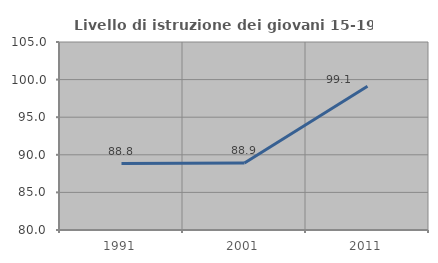
| Category | Livello di istruzione dei giovani 15-19 anni |
|---|---|
| 1991.0 | 88.838 |
| 2001.0 | 88.908 |
| 2011.0 | 99.129 |